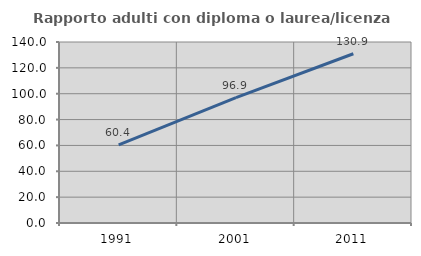
| Category | Rapporto adulti con diploma o laurea/licenza media  |
|---|---|
| 1991.0 | 60.377 |
| 2001.0 | 96.914 |
| 2011.0 | 130.928 |